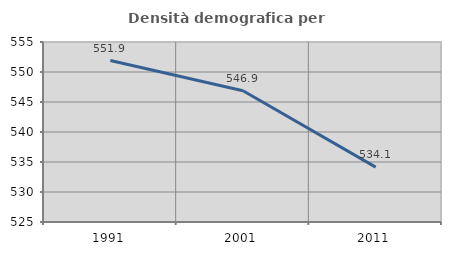
| Category | Densità demografica |
|---|---|
| 1991.0 | 551.908 |
| 2001.0 | 546.887 |
| 2011.0 | 534.142 |